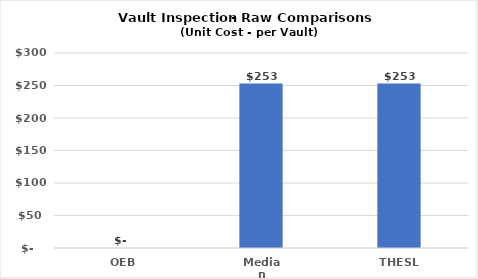
| Category | Series 0 |
|---|---|
| OEB | 0 |
| Median | 253 |
| THESL | 253 |